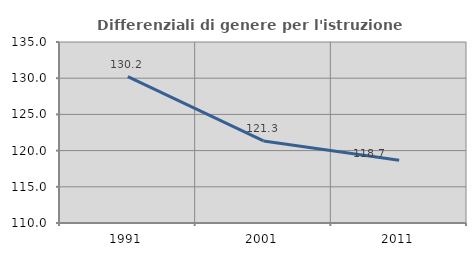
| Category | Differenziali di genere per l'istruzione superiore |
|---|---|
| 1991.0 | 130.214 |
| 2001.0 | 121.335 |
| 2011.0 | 118.653 |